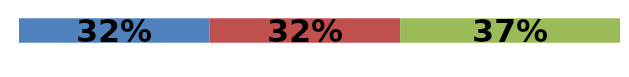
| Category | Series 0 | Series 1 | Series 2 |
|---|---|---|---|
| 0 | 0.317 | 0.317 | 0.366 |